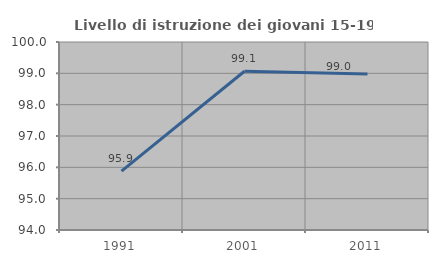
| Category | Livello di istruzione dei giovani 15-19 anni |
|---|---|
| 1991.0 | 95.876 |
| 2001.0 | 99.065 |
| 2011.0 | 98.98 |